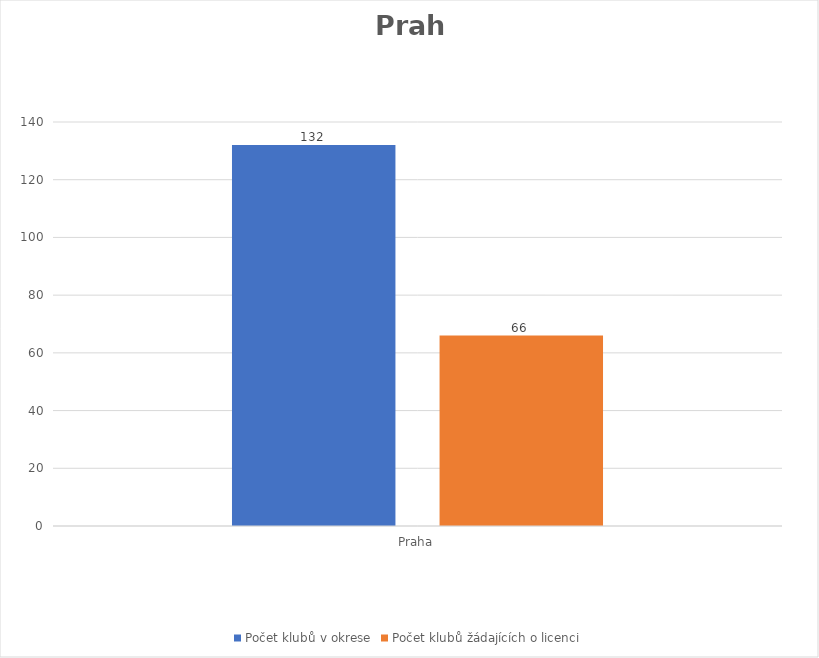
| Category | Počet klubů v okrese | Počet klubů žádajících o licenci |
|---|---|---|
| Praha | 132 | 66 |